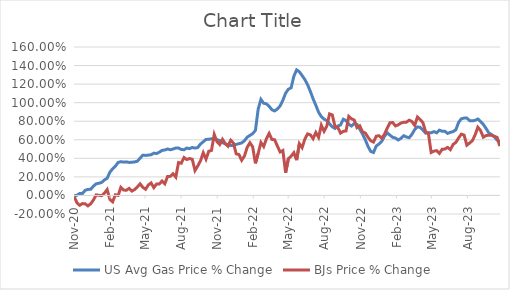
| Category | US Avg Gas Price % Change | BJs Price % Change |
|---|---|---|
| 2020-11-16 | -0.004 | -0.011 |
| 2020-11-23 | 0.002 | -0.079 |
| 2020-11-30 | 0.021 | -0.106 |
| 2020-12-07 | 0.021 | -0.088 |
| 2020-12-14 | 0.055 | -0.09 |
| 2020-12-21 | 0.065 | -0.112 |
| 2020-12-28 | 0.066 | -0.09 |
| 2021-01-04 | 0.1 | -0.05 |
| 2021-01-11 | 0.125 | 0.006 |
| 2021-01-18 | 0.131 | 0.002 |
| 2021-01-25 | 0.14 | -0.003 |
| 2021-02-01 | 0.167 | 0.024 |
| 2021-02-08 | 0.185 | 0.063 |
| 2021-02-15 | 0.251 | -0.043 |
| 2021-02-22 | 0.287 | -0.069 |
| 2021-03-01 | 0.316 | 0.008 |
| 2021-03-08 | 0.356 | 0.001 |
| 2021-03-15 | 0.364 | 0.088 |
| 2021-03-22 | 0.359 | 0.058 |
| 2021-03-29 | 0.362 | 0.056 |
| 2021-04-05 | 0.356 | 0.076 |
| 2021-04-12 | 0.358 | 0.047 |
| 2021-04-19 | 0.361 | 0.064 |
| 2021-04-26 | 0.369 | 0.092 |
| 2021-05-03 | 0.402 | 0.125 |
| 2021-05-10 | 0.434 | 0.087 |
| 2021-05-17 | 0.431 | 0.066 |
| 2021-05-24 | 0.435 | 0.113 |
| 2021-05-31 | 0.438 | 0.135 |
| 2021-06-07 | 0.456 | 0.084 |
| 2021-06-14 | 0.452 | 0.123 |
| 2021-06-21 | 0.466 | 0.124 |
| 2021-06-28 | 0.486 | 0.156 |
| 2021-07-05 | 0.49 | 0.125 |
| 2021-07-12 | 0.501 | 0.205 |
| 2021-07-19 | 0.493 | 0.206 |
| 2021-07-26 | 0.5 | 0.234 |
| 2021-08-02 | 0.511 | 0.197 |
| 2021-08-09 | 0.51 | 0.355 |
| 2021-08-16 | 0.496 | 0.347 |
| 2021-08-23 | 0.493 | 0.409 |
| 2021-08-30 | 0.511 | 0.387 |
| 2021-09-06 | 0.505 | 0.399 |
| 2021-09-13 | 0.517 | 0.39 |
| 2021-09-20 | 0.51 | 0.269 |
| 2021-09-27 | 0.517 | 0.318 |
| 2021-10-04 | 0.554 | 0.374 |
| 2021-10-11 | 0.578 | 0.46 |
| 2021-10-18 | 0.604 | 0.391 |
| 2021-10-25 | 0.605 | 0.476 |
| 2021-11-01 | 0.611 | 0.486 |
| 2021-11-08 | 0.603 | 0.657 |
| 2021-11-15 | 0.601 | 0.58 |
| 2021-11-22 | 0.592 | 0.548 |
| 2021-11-29 | 0.57 | 0.605 |
| 2021-12-06 | 0.557 | 0.558 |
| 2021-12-13 | 0.546 | 0.53 |
| 2021-12-20 | 0.537 | 0.595 |
| 2021-12-27 | 0.539 | 0.564 |
| 2022-01-03 | 0.55 | 0.448 |
| 2022-01-10 | 0.558 | 0.441 |
| 2022-01-17 | 0.566 | 0.379 |
| 2022-01-24 | 0.59 | 0.425 |
| 2022-01-31 | 0.628 | 0.518 |
| 2022-02-07 | 0.647 | 0.568 |
| 2022-02-14 | 0.666 | 0.524 |
| 2022-02-21 | 0.701 | 0.346 |
| 2022-02-28 | 0.93 | 0.453 |
| 2022-03-07 | 1.035 | 0.571 |
| 2022-03-14 | 0.994 | 0.527 |
| 2022-03-21 | 0.988 | 0.61 |
| 2022-03-28 | 0.961 | 0.669 |
| 2022-04-04 | 0.924 | 0.604 |
| 2022-04-11 | 0.911 | 0.6 |
| 2022-04-18 | 0.932 | 0.532 |
| 2022-04-25 | 0.965 | 0.469 |
| 2022-05-02 | 1.026 | 0.484 |
| 2022-05-09 | 1.102 | 0.245 |
| 2022-05-16 | 1.145 | 0.396 |
| 2022-05-23 | 1.16 | 0.424 |
| 2022-05-30 | 1.285 | 0.461 |
| 2022-06-06 | 1.353 | 0.38 |
| 2022-06-13 | 1.333 | 0.558 |
| 2022-06-20 | 1.292 | 0.515 |
| 2022-06-27 | 1.249 | 0.607 |
| 2022-07-04 | 1.193 | 0.664 |
| 2022-07-11 | 1.122 | 0.654 |
| 2022-07-18 | 1.042 | 0.612 |
| 2022-07-25 | 0.972 | 0.679 |
| 2022-08-01 | 0.898 | 0.626 |
| 2022-08-08 | 0.849 | 0.757 |
| 2022-08-15 | 0.823 | 0.692 |
| 2022-08-22 | 0.807 | 0.747 |
| 2022-08-29 | 0.771 | 0.879 |
| 2022-09-05 | 0.74 | 0.868 |
| 2022-09-12 | 0.722 | 0.741 |
| 2022-09-19 | 0.749 | 0.734 |
| 2022-09-26 | 0.76 | 0.672 |
| 2022-10-03 | 0.821 | 0.691 |
| 2022-10-10 | 0.807 | 0.695 |
| 2022-10-17 | 0.768 | 0.853 |
| 2022-10-24 | 0.748 | 0.826 |
| 2022-10-31 | 0.775 | 0.813 |
| 2022-11-07 | 0.765 | 0.731 |
| 2022-11-14 | 0.715 | 0.75 |
| 2022-11-21 | 0.663 | 0.686 |
| 2022-11-28 | 0.601 | 0.673 |
| 2022-12-05 | 0.529 | 0.628 |
| 2022-12-12 | 0.474 | 0.589 |
| 2022-12-19 | 0.462 | 0.575 |
| 2022-12-26 | 0.533 | 0.639 |
| 2023-01-02 | 0.554 | 0.644 |
| 2023-01-09 | 0.583 | 0.617 |
| 2023-01-16 | 0.637 | 0.66 |
| 2023-01-23 | 0.675 | 0.726 |
| 2023-01-30 | 0.65 | 0.783 |
| 2023-02-06 | 0.626 | 0.786 |
| 2023-02-13 | 0.618 | 0.749 |
| 2023-02-20 | 0.598 | 0.761 |
| 2023-02-27 | 0.615 | 0.78 |
| 2023-03-06 | 0.644 | 0.789 |
| 2023-03-13 | 0.63 | 0.79 |
| 2023-03-20 | 0.622 | 0.811 |
| 2023-03-27 | 0.659 | 0.796 |
| 2023-04-03 | 0.71 | 0.755 |
| 2023-04-10 | 0.739 | 0.845 |
| 2023-04-17 | 0.734 | 0.818 |
| 2023-04-24 | 0.705 | 0.785 |
| 2023-05-01 | 0.671 | 0.686 |
| 2023-05-08 | 0.675 | 0.67 |
| 2023-05-15 | 0.675 | 0.463 |
| 2023-05-22 | 0.688 | 0.477 |
| 2023-05-29 | 0.675 | 0.483 |
| 2023-06-05 | 0.704 | 0.454 |
| 2023-06-12 | 0.692 | 0.497 |
| 2023-06-19 | 0.691 | 0.5 |
| 2023-06-26 | 0.669 | 0.518 |
| 2023-07-03 | 0.68 | 0.494 |
| 2023-07-10 | 0.688 | 0.55 |
| 2023-07-17 | 0.708 | 0.572 |
| 2023-07-24 | 0.788 | 0.62 |
| 2023-07-31 | 0.827 | 0.661 |
| 2023-08-07 | 0.834 | 0.65 |
| 2023-08-14 | 0.835 | 0.542 |
| 2023-08-21 | 0.806 | 0.565 |
| 2023-08-28 | 0.804 | 0.59 |
| 2023-09-04 | 0.809 | 0.652 |
| 2023-09-11 | 0.824 | 0.735 |
| 2023-09-18 | 0.796 | 0.699 |
| 2023-09-25 | 0.765 | 0.628 |
| 2023-10-02 | 0.722 | 0.645 |
| 2023-10-09 | 0.674 | 0.649 |
| 2023-10-16 | 0.657 | 0.648 |
| 2023-10-23 | 0.633 | 0.637 |
| 2023-10-30 | 0.596 | 0.626 |
| 2023-11-06 | 0.58 | 0.532 |